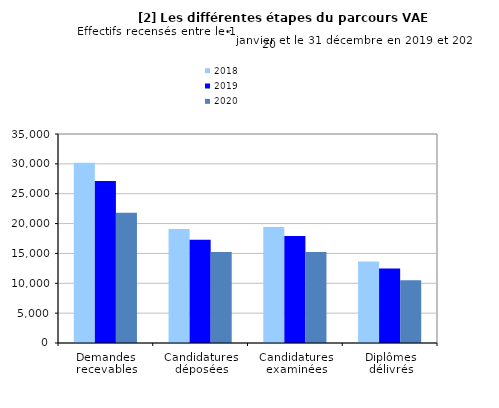
| Category | 2018 | 2019 | 2020 |
|---|---|---|---|
| Demandes recevables | 30188 | 27128 | 21830 |
| Candidatures déposées | 19070 | 17289 | 15230 |
| Candidatures examinées | 19436 | 17913 | 15246 |
| Diplômes délivrés | 13652 | 12462 | 10494 |